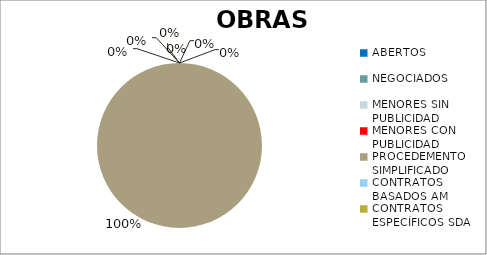
| Category | Series 0 |
|---|---|
| ABERTOS  | 0 |
| NEGOCIADOS  | 0 |
| MENORES SIN PUBLICIDAD | 0 |
| MENORES CON PUBLICIDAD | 0 |
| PROCEDEMENTO SIMPLIFICADO | 1 |
| CONTRATOS BASADOS AM | 0 |
| CONTRATOS ESPECÍFICOS SDA | 0 |